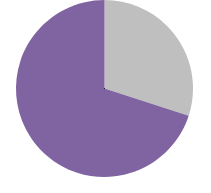
| Category | Kör |
|---|---|
| 0 | 30 |
| 1 | 70 |